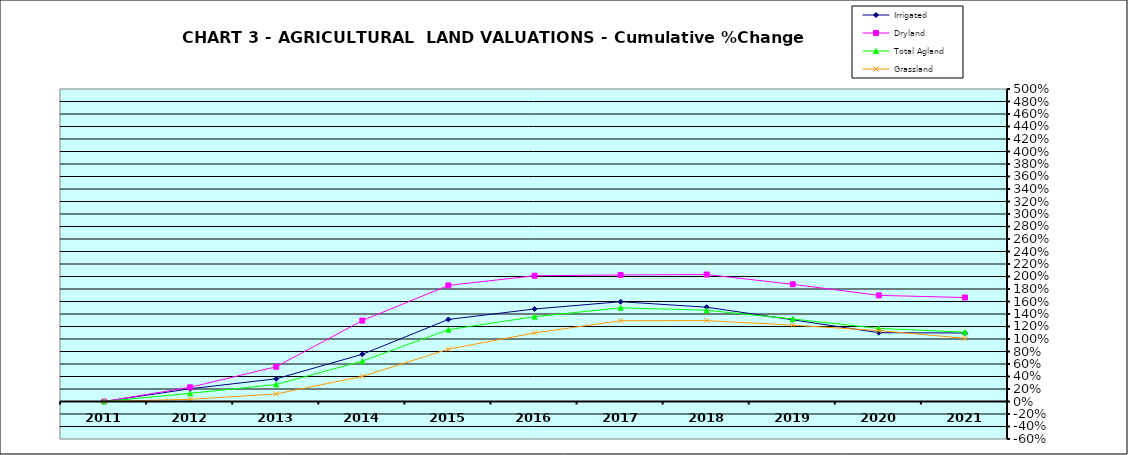
| Category | Irrigated | Dryland | Total Agland | Grassland |
|---|---|---|---|---|
| 2011.0 | 0 | 0 | 0 | 0 |
| 2012.0 | 0.204 | 0.227 | 0.131 | 0.035 |
| 2013.0 | 0.363 | 0.556 | 0.272 | 0.121 |
| 2014.0 | 0.755 | 1.295 | 0.646 | 0.402 |
| 2015.0 | 1.313 | 1.857 | 1.149 | 0.837 |
| 2016.0 | 1.48 | 2.012 | 1.357 | 1.097 |
| 2017.0 | 1.597 | 2.024 | 1.499 | 1.292 |
| 2018.0 | 1.509 | 2.031 | 1.46 | 1.294 |
| 2019.0 | 1.307 | 1.875 | 1.32 | 1.221 |
| 2020.0 | 1.101 | 1.698 | 1.17 | 1.135 |
| 2021.0 | 1.096 | 1.663 | 1.109 | 1.012 |